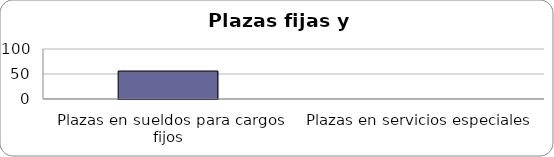
| Category | Series 0 |
|---|---|
| Plazas en sueldos para cargos fijos | 56 |
| Plazas en servicios especiales | 0 |